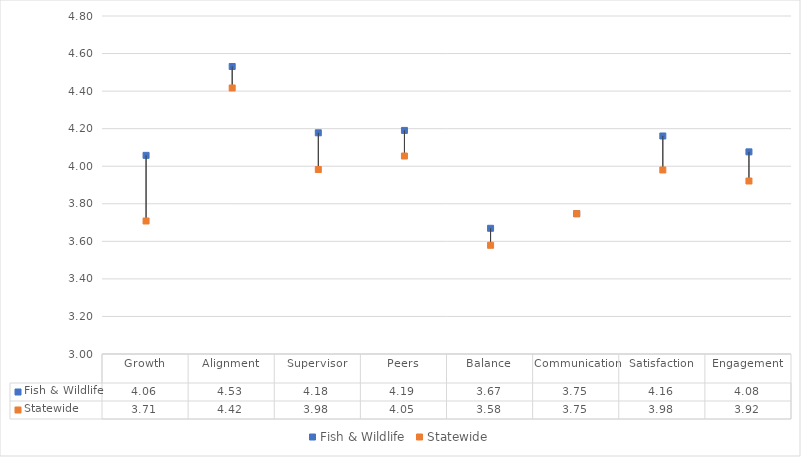
| Category | Fish & Wildlife | Statewide |
|---|---|---|
| Growth | 4.058 | 3.708 |
| Alignment | 4.531 | 4.417 |
| Supervisor | 4.178 | 3.983 |
| Peers | 4.191 | 4.054 |
| Balance | 3.669 | 3.579 |
| Communication | 3.747 | 3.747 |
| Satisfaction | 4.161 | 3.98 |
| Engagement | 4.076 | 3.921 |